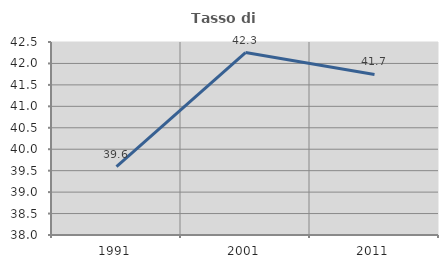
| Category | Tasso di occupazione   |
|---|---|
| 1991.0 | 39.594 |
| 2001.0 | 42.254 |
| 2011.0 | 41.745 |